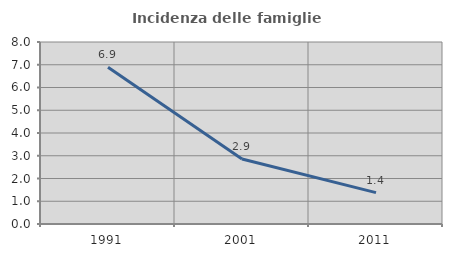
| Category | Incidenza delle famiglie numerose |
|---|---|
| 1991.0 | 6.894 |
| 2001.0 | 2.859 |
| 2011.0 | 1.378 |